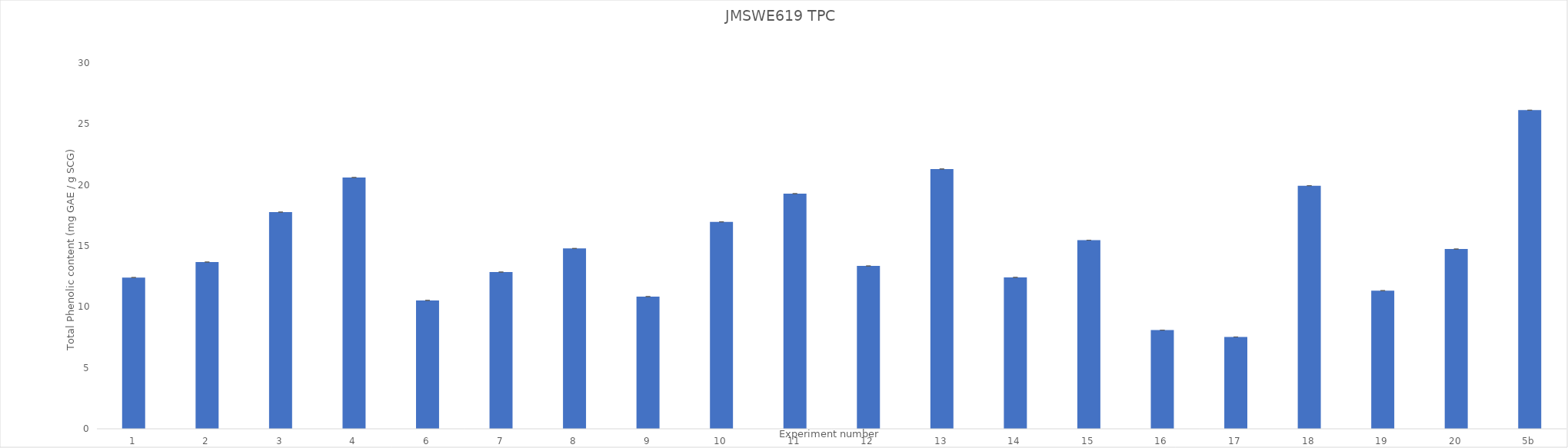
| Category | Series 0 |
|---|---|
| 1 | 12.406 |
| 2 | 13.676 |
| 3 | 17.774 |
| 4 | 20.609 |
| 6 | 10.53 |
| 7 | 12.856 |
| 8 | 14.791 |
| 9 | 10.844 |
| 10 | 16.972 |
| 11 | 19.284 |
| 12 | 13.356 |
| 13 | 21.309 |
| 14 | 12.415 |
| 15 | 15.472 |
| 16 | 8.091 |
| 17 | 7.534 |
| 18 | 19.938 |
| 19 | 11.331 |
| 20 | 14.743 |
| 5b | 26.135 |